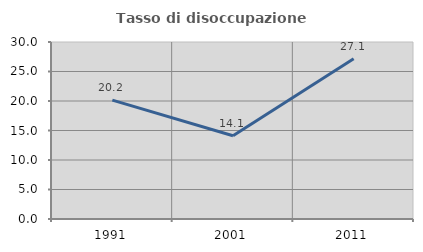
| Category | Tasso di disoccupazione giovanile  |
|---|---|
| 1991.0 | 20.155 |
| 2001.0 | 14.118 |
| 2011.0 | 27.143 |